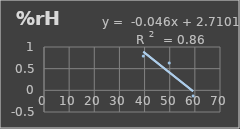
| Category | Humedad |
|---|---|
| 39.5 | 0.79 |
| 49.8 | 0.63 |
| 59.3 | -0.13 |